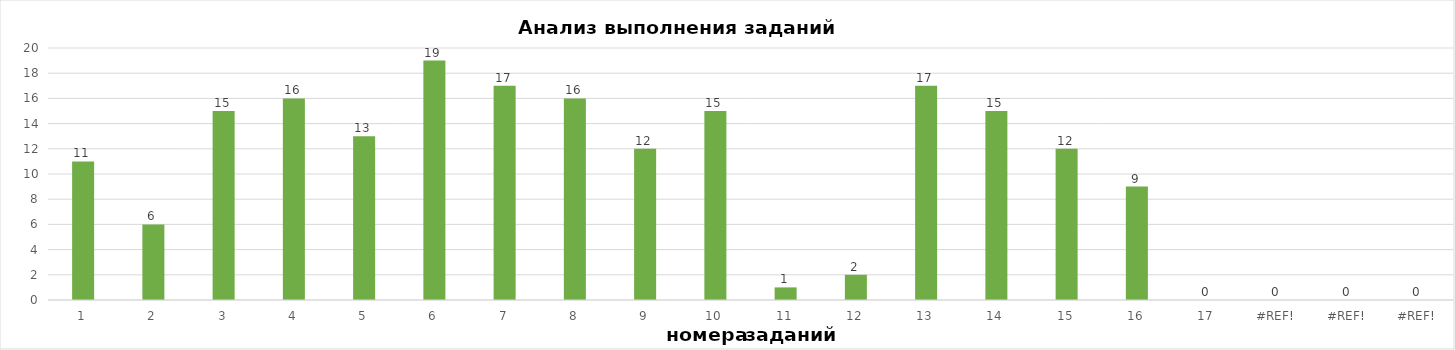
| Category | задания |
|---|---|
| 1.0 | 11 |
| 2.0 | 6 |
| 3.0 | 15 |
| 4.0 | 16 |
| 5.0 | 13 |
| 6.0 | 19 |
| 7.0 | 17 |
| 8.0 | 16 |
| 9.0 | 12 |
| 10.0 | 15 |
| 11.0 | 1 |
| 12.0 | 2 |
| 13.0 | 17 |
| 14.0 | 15 |
| 15.0 | 12 |
| 16.0 | 9 |
| 17.0 | 0 |
| 0.0 | 0 |
| 0.0 | 0 |
| 0.0 | 0 |